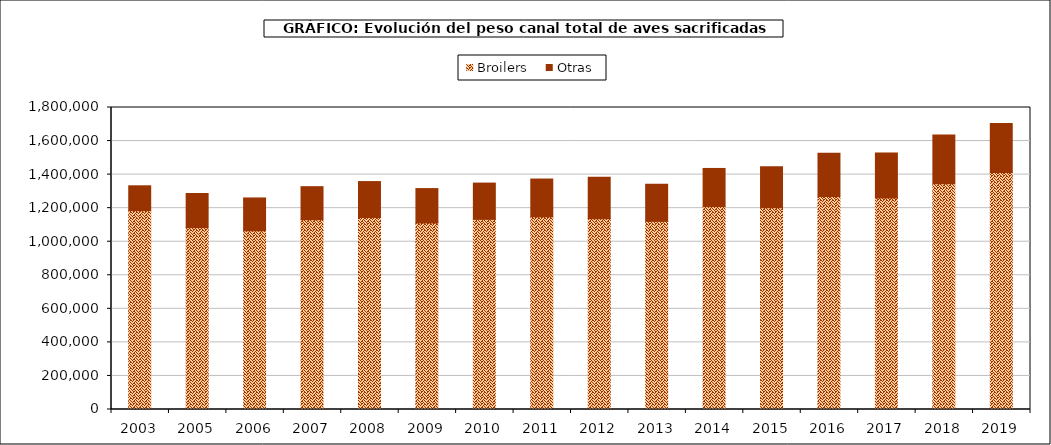
| Category | Broilers | Otras |
|---|---|---|
| 2003.0 | 1185382.351 | 147954.456 |
| 2005.0 | 1083967.626 | 203454.751 |
| 2006.0 | 1064943.635 | 195909.128 |
| 2007.0 | 1131030.91 | 197060.388 |
| 2008.0 | 1144285.376 | 214254.063 |
| 2009.0 | 1111683.614 | 204985.916 |
| 2010.0 | 1133430.435 | 215999.184 |
| 2011.0 | 1148388.725 | 225215.047 |
| 2012.0 | 1137190.775 | 247051.951 |
| 2013.0 | 1121294.618 | 221283.736 |
| 2014.0 | 1209068.651 | 227620.21 |
| 2015.0 | 1203021.781 | 243968.571 |
| 2016.0 | 1269476.951 | 257153.803 |
| 2017.0 | 1259941.852 | 268903.127 |
| 2018.0 | 1345687.02 | 291131.521 |
| 2019.0 | 1412223.192 | 292967.022 |